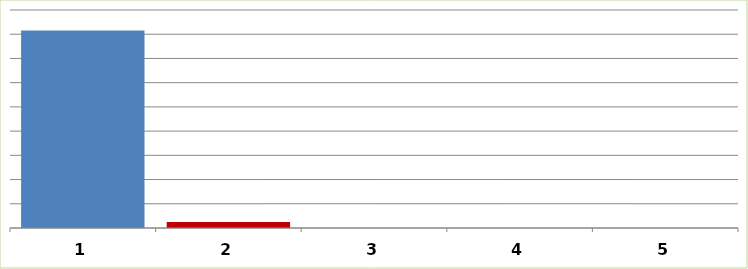
| Category | Series 0 |
|---|---|
| 0 | 1630354 |
| 1 | 49600 |
| 2 | 0 |
| 3 | 0 |
| 4 | 0 |